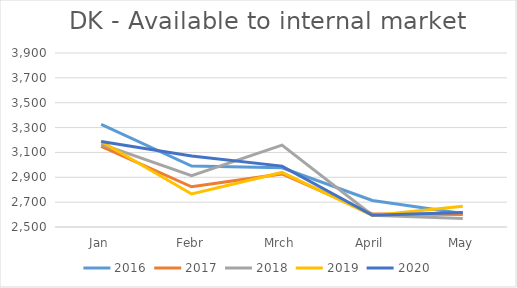
| Category | 2016 | 2017 | 2018 | 2019 | 2020 |
|---|---|---|---|---|---|
| Jan | 3325 | 3148.502 | 3167.287 | 3188.21 | 3187.423 |
| Febr | 2990 | 2823.321 | 2912.307 | 2766.003 | 3070.967 |
| Mrch | 2976 | 2927.113 | 3159.24 | 2938.914 | 2989.756 |
| April | 2713 | 2605.766 | 2594.224 | 2593.21 | 2593.73 |
| May | 2608 | 2599.848 | 2567.575 | 2667.798 | 2615.72 |